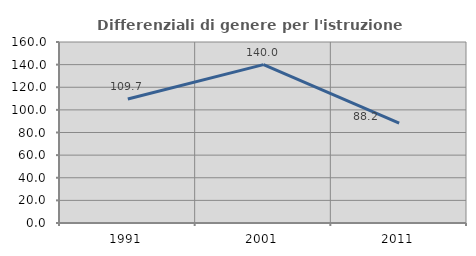
| Category | Differenziali di genere per l'istruzione superiore |
|---|---|
| 1991.0 | 109.674 |
| 2001.0 | 140 |
| 2011.0 | 88.246 |